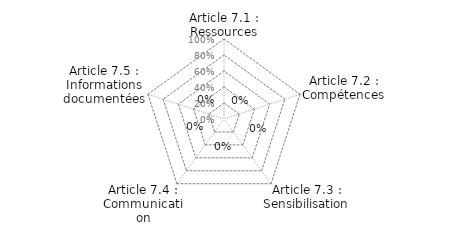
| Category | Article 7 : Support |
|---|---|
| Article 7.1 : Ressources | 0 |
| Article 7.2 : Compétences | 0 |
| Article 7.3 : Sensibilisation | 0 |
| Article 7.4 : Communication | 0 |
| Article 7.5 : Informations documentées | 0 |